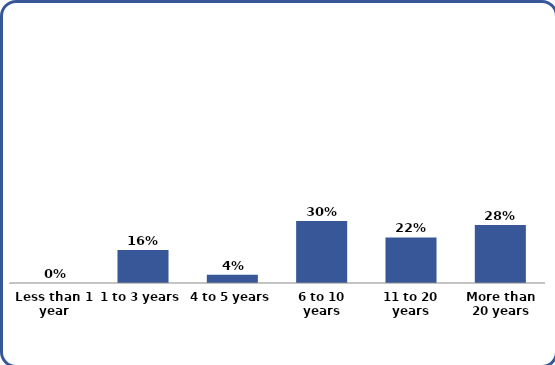
| Category | Series 0 |
|---|---|
| Less than 1 year | 0 |
| 1 to 3 years | 0.16 |
| 4 to 5 years | 0.04 |
| 6 to 10 years | 0.3 |
| 11 to 20 years | 0.22 |
| More than 20 years | 0.28 |